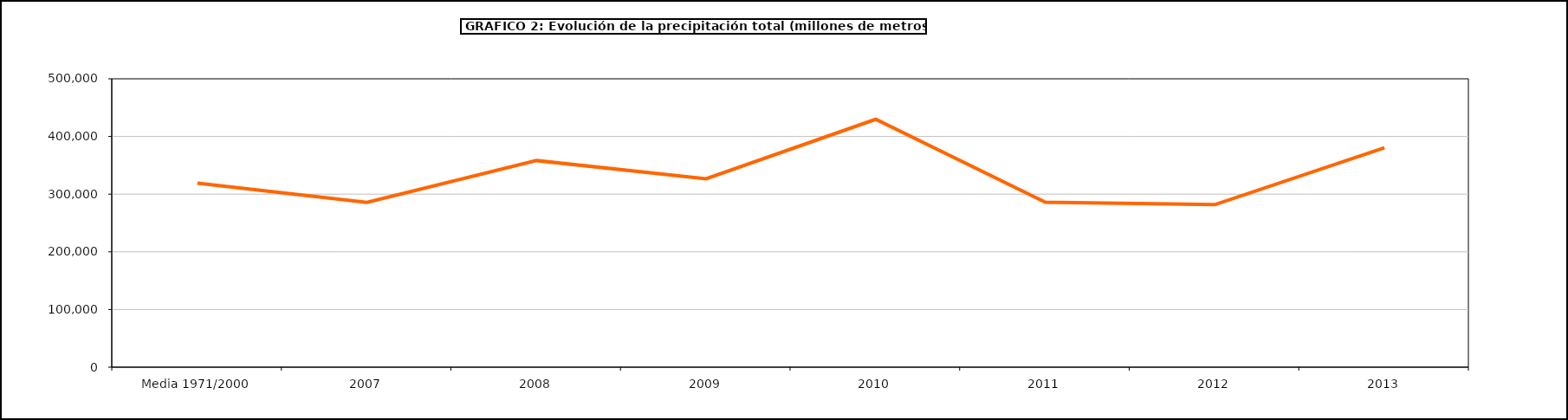
| Category | total |
|---|---|
| 0 | 318917 |
| 1 | 285630.26 |
| 2 | 358273.25 |
| 3 | 326778 |
| 4 | 429768 |
| 5 | 285948 |
| 6 | 281817 |
| 7 | 380420 |